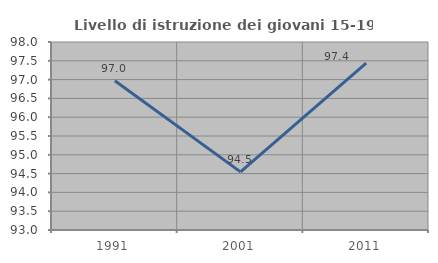
| Category | Livello di istruzione dei giovani 15-19 anni |
|---|---|
| 1991.0 | 96.97 |
| 2001.0 | 94.545 |
| 2011.0 | 97.436 |